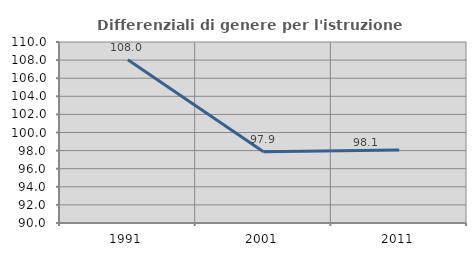
| Category | Differenziali di genere per l'istruzione superiore |
|---|---|
| 1991.0 | 108.03 |
| 2001.0 | 97.867 |
| 2011.0 | 98.08 |